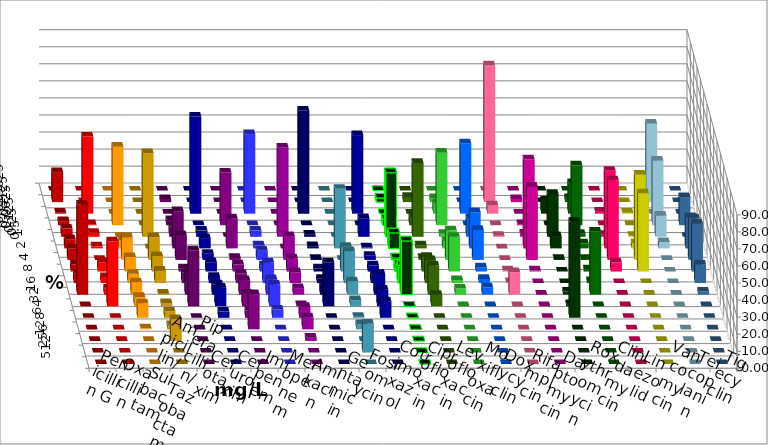
| Category | Penicillin G | Oxacillin | Ampicillin/ Sulbactam | Piperacillin/ Tazobactam | Cefotaxim | Cefuroxim | Imipenem | Meropenem | Amikacin | Gentamicin | Fosfomycin | Cotrimoxazol | Ciprofloxacin | Levofloxacin | Moxifloxacin | Doxycyclin | Rifampicin | Daptomycin | Roxythromycin | Clindamycin | Linezolid | Vancomycin | Teicoplanin | Tigecyclin |
|---|---|---|---|---|---|---|---|---|---|---|---|---|---|---|---|---|---|---|---|---|---|---|---|---|
| 0.015625 | 0 | 0 | 0 | 0 | 0 | 0 | 0 | 0 | 0 | 0 | 0 | 0 | 0 | 0 | 0 | 0 | 0 | 0 | 0 | 0 | 0 | 0 | 0 | 0 |
| 0.03125 | 17.576 | 0 | 0 | 0 | 1.818 | 0 | 0 | 0 | 0 | 0 | 0 | 0 | 2.424 | 3.049 | 2.395 | 0 | 80.12 | 1.818 | 0 | 2.381 | 0 | 0 | 0 | 45.963 |
| 0.0625 | 0.606 | 45.238 | 0 | 0 | 0 | 0 | 56.97 | 46.667 | 0 | 60.377 | 0 | 46.061 | 0 | 0 | 5.988 | 41.212 | 4.819 | 0 | 7.784 | 17.857 | 1.198 | 0.595 | 0 | 0 |
| 0.125 | 2.424 | 0.595 | 46.061 | 0 | 3.03 | 30.909 | 0 | 0 | 0 | 0 | 0 | 0 | 3.636 | 4.878 | 42.515 | 0 | 0 | 0.606 | 0 | 35.119 | 0 | 0 | 16.463 | 37.888 |
| 0.25 | 4.848 | 2.381 | 0 | 49.091 | 6.061 | 0 | 3.636 | 3.636 | 52.229 | 1.258 | 0 | 10.909 | 37.576 | 43.293 | 1.796 | 10.909 | 0.602 | 1.818 | 25.15 | 1.786 | 1.198 | 0.595 | 0 | 12.422 |
| 0.5 | 5.455 | 1.19 | 4.848 | 0 | 21.818 | 17.576 | 6.061 | 1.818 | 0 | 1.258 | 34.94 | 0.606 | 9.091 | 1.829 | 4.192 | 21.212 | 0 | 52.121 | 7.186 | 2.976 | 45.509 | 2.976 | 18.293 | 3.727 |
| 1.0 | 6.667 | 0 | 13.333 | 13.333 | 14.545 | 1.212 | 3.636 | 5.455 | 14.013 | 0.629 | 0 | 2.424 | 1.212 | 1.22 | 17.365 | 17.576 | 0 | 43.03 | 0.599 | 0.595 | 46.707 | 50 | 24.39 | 0 |
| 2.0 | 4.242 | 5.357 | 8.485 | 9.091 | 1.818 | 4.242 | 5.455 | 3.636 | 7.643 | 1.887 | 14.458 | 3.636 | 4.242 | 8.537 | 20.359 | 2.424 | 0.602 | 0.606 | 0 | 1.19 | 5.389 | 45.833 | 28.049 | 0 |
| 4.0 | 5.455 | 3.571 | 5.455 | 7.273 | 6.061 | 5.455 | 3.636 | 12.121 | 6.369 | 2.516 | 18.675 | 4.848 | 10.303 | 13.415 | 1.796 | 2.424 | 0.602 | 0 | 0 | 1.19 | 0 | 0 | 10.976 | 0 |
| 8.0 | 52.727 | 3.571 | 7.273 | 0.606 | 12.121 | 8.485 | 6.061 | 9.091 | 3.822 | 6.289 | 7.831 | 12.121 | 31.515 | 17.073 | 3.593 | 4.242 | 13.253 | 0 | 1.796 | 36.905 | 0 | 0 | 1.829 | 0 |
| 16.0 | 0 | 38.095 | 5.455 | 1.818 | 32.727 | 7.273 | 10.909 | 12.727 | 0.637 | 25.786 | 3.614 | 9.697 | 0 | 6.707 | 0 | 0 | 0 | 0 | 1.198 | 0 | 0 | 0 | 0 | 0 |
| 32.0 | 0 | 0 | 8.485 | 3.636 | 0 | 4.242 | 3.636 | 4.848 | 6.369 | 0 | 0.602 | 9.697 | 0 | 0 | 0 | 0 | 0 | 0 | 56.287 | 0 | 0 | 0 | 0 | 0 |
| 64.0 | 0 | 0 | 0.606 | 2.424 | 0 | 20.606 | 0 | 0 | 7.006 | 0 | 3.012 | 0 | 0 | 0 | 0 | 0 | 0 | 0 | 0 | 0 | 0 | 0 | 0 | 0 |
| 128.0 | 0 | 0 | 0 | 12.727 | 0 | 0 | 0 | 0 | 1.911 | 0 | 0 | 0 | 0 | 0 | 0 | 0 | 0 | 0 | 0 | 0 | 0 | 0 | 0 | 0 |
| 256.0 | 0 | 0 | 0 | 0 | 0 | 0 | 0 | 0 | 0 | 0 | 16.867 | 0 | 0 | 0 | 0 | 0 | 0 | 0 | 0 | 0 | 0 | 0 | 0 | 0 |
| 512.0 | 0 | 0 | 0 | 0 | 0 | 0 | 0 | 0 | 0 | 0 | 0 | 0 | 0 | 0 | 0 | 0 | 0 | 0 | 0 | 0 | 0 | 0 | 0 | 0 |